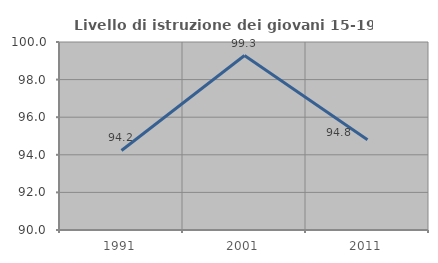
| Category | Livello di istruzione dei giovani 15-19 anni |
|---|---|
| 1991.0 | 94.231 |
| 2001.0 | 99.281 |
| 2011.0 | 94.798 |